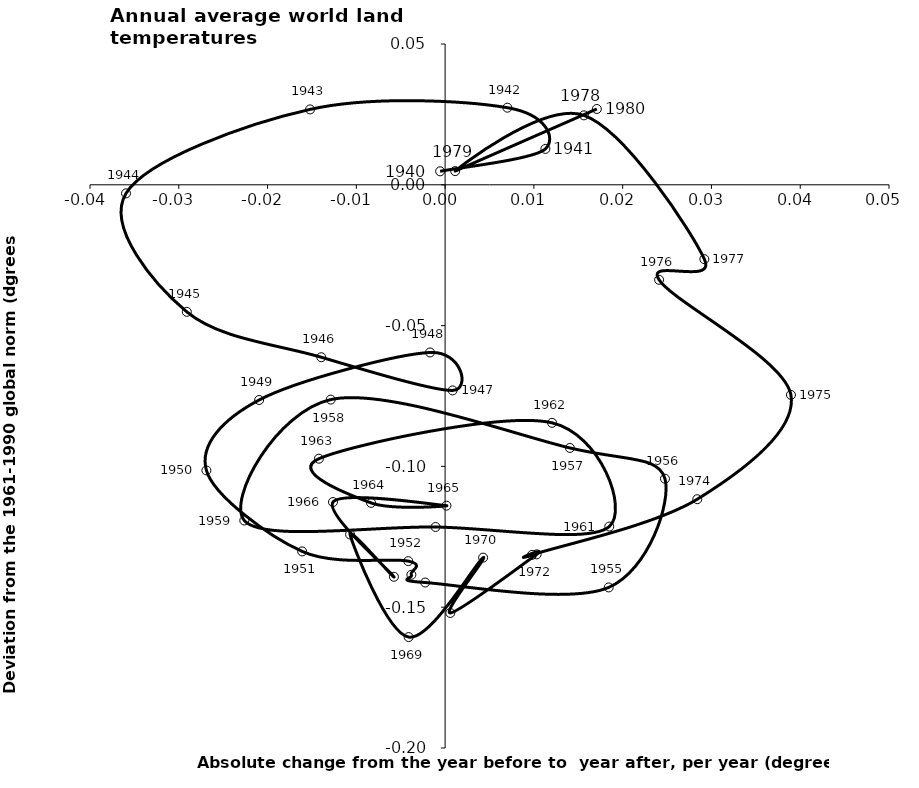
| Category | Series 0 |
|---|---|
| -0.0005606060606060618 | 0.005 |
| 0.011295454545454544 | 0.013 |
| 0.007015151515151517 | 0.027 |
| -0.015212121212121213 | 0.027 |
| -0.03594318181818182 | -0.003 |
| -0.02909469696969697 | -0.045 |
| -0.013950757575757578 | -0.061 |
| 0.0008484848484848449 | -0.073 |
| -0.0017007575757575777 | -0.06 |
| -0.020946969696969693 | -0.076 |
| -0.026886363636363632 | -0.101 |
| -0.01610227272727273 | -0.13 |
| -0.004147727272727275 | -0.134 |
| -0.003799242424242427 | -0.138 |
| -0.002246212121212121 | -0.141 |
| 0.0184280303030303 | -0.143 |
| 0.024765151515151518 | -0.104 |
| 0.01405303030303031 | -0.093 |
| -0.012882575757575752 | -0.076 |
| -0.02262121212121211 | -0.119 |
| -0.0010757575757575771 | -0.122 |
| 0.01849242424242422 | -0.121 |
| 0.01204924242424242 | -0.085 |
| -0.01421590909090907 | -0.097 |
| -0.008337121212121205 | -0.113 |
| 0.00015151515151514555 | -0.114 |
| -0.012628787878787878 | -0.113 |
| -0.005765151515151529 | -0.139 |
| -0.010704545454545467 | -0.124 |
| -0.004106060606060599 | -0.161 |
| 0.004280303030303037 | -0.132 |
| 0.0005833333333333385 | -0.152 |
| 0.010310606060606062 | -0.131 |
| 0.009791666666666678 | -0.131 |
| 0.028405303030303024 | -0.112 |
| 0.03895454545454544 | -0.075 |
| 0.024102272727272722 | -0.034 |
| 0.029200757575757567 | -0.026 |
| 0.015636363636363636 | 0.025 |
| 0.0011325757575757593 | 0.005 |
| 0.017090909090909094 | 0.027 |